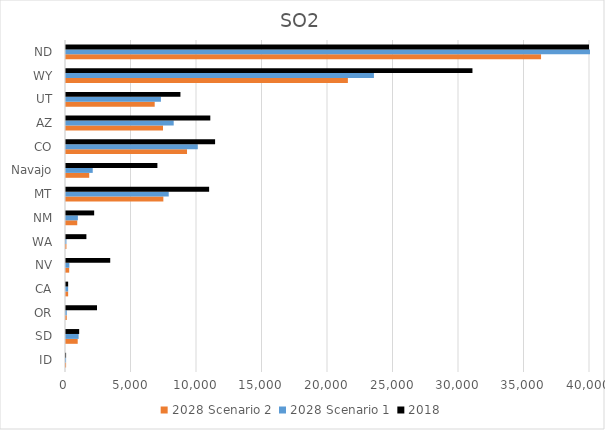
| Category | 2028 Scenario 2 | 2028 Scenario 1 | 2018 |
|---|---|---|---|
| ID | 7.079 | 7.079 | 7.079 |
| SD | 893.327 | 964.105 | 1005.608 |
| OR | 58.821 | 58.821 | 2366.7 |
| CA | 164.209 | 164.209 | 164.209 |
| NV | 244.042 | 256.45 | 3376.282 |
| WA | 32.646 | 32.646 | 1556.954 |
| NM | 858.429 | 906.769 | 2150.515 |
| MT | 7431.439 | 7842.193 | 10925.828 |
| Navajo | 1772.509 | 2041 | 6977.309 |
| CO | 9237.953 | 10060.749 | 11381.363 |
| AZ | 7405.043 | 8221.256 | 11015.672 |
| UT | 6770.848 | 7245.514 | 8735.123 |
| WY | 21517.315 | 23505.539 | 31026.839 |
| ND | 36263.267 | 39998.518 | 40202.657 |